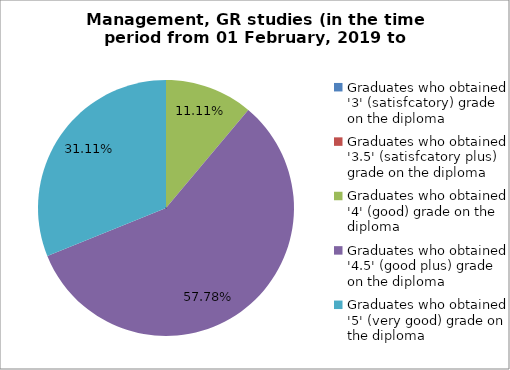
| Category | Series 0 |
|---|---|
| Graduates who obtained '3' (satisfcatory) grade on the diploma | 0 |
| Graduates who obtained '3.5' (satisfcatory plus) grade on the diploma | 0 |
| Graduates who obtained '4' (good) grade on the diploma | 11.111 |
| Graduates who obtained '4.5' (good plus) grade on the diploma | 57.778 |
| Graduates who obtained '5' (very good) grade on the diploma | 31.111 |